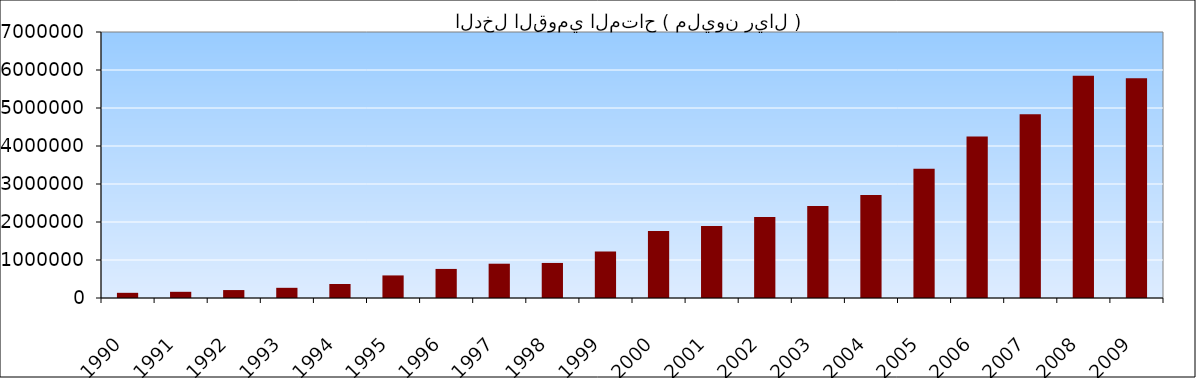
| Category | الدخل القومي المتاح ( مليون ريال ) |
|---|---|
| 1990.0 | 136246 |
| 1991.0 | 163047 |
| 1992.0 | 208746 |
| 1993.0 | 268022 |
| 1994.0 | 368898 |
| 1995.0 | 594037 |
| 1996.0 | 765069 |
| 1997.0 | 902287 |
| 1998.0 | 922382 |
| 1999.0 | 1222500 |
| 2000.0 | 1764684.994 |
| 2001.0 | 1895926.763 |
| 2002.0 | 2132678.871 |
| 2003.0 | 2421489.143 |
| 2004.0 | 2707697.021 |
| 2005.0 | 3398335.255 |
| 2006.0 | 4252222.45 |
| 2007.0 | 4837618.511 |
| 2008.0 | 5850731.957 |
| 2009.0 | 5780684.647 |